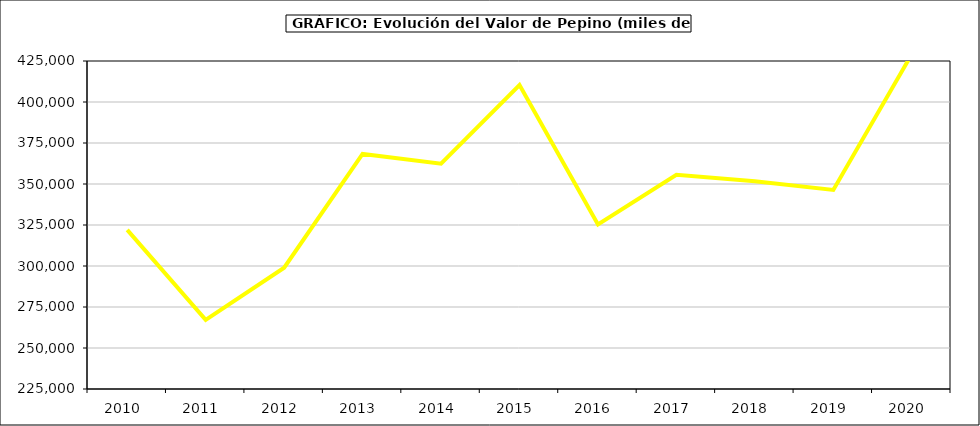
| Category | Valor |
|---|---|
| 2010.0 | 322047.392 |
| 2011.0 | 267189.859 |
| 2012.0 | 298950.9 |
| 2013.0 | 368300.179 |
| 2014.0 | 362347 |
| 2015.0 | 410299 |
| 2016.0 | 325360 |
| 2017.0 | 355598.015 |
| 2018.0 | 351610.152 |
| 2019.0 | 346372.719 |
| 2020.0 | 429148.693 |